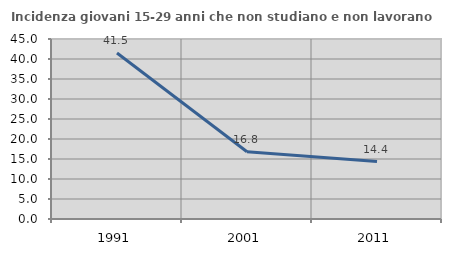
| Category | Incidenza giovani 15-29 anni che non studiano e non lavorano  |
|---|---|
| 1991.0 | 41.5 |
| 2001.0 | 16.818 |
| 2011.0 | 14.362 |